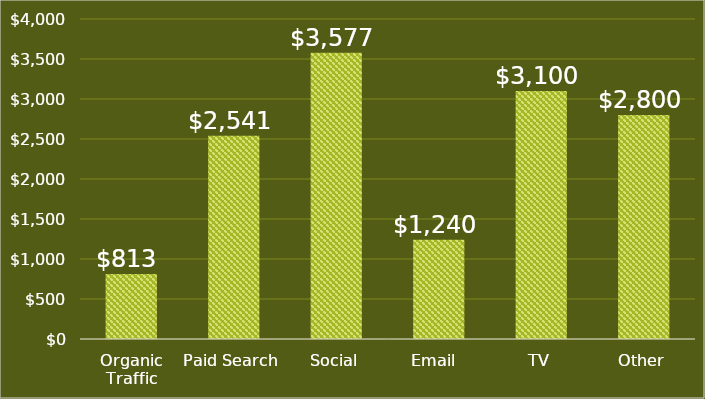
| Category | Profit per Acquisition |
|---|---|
| Organic Traffic | 813 |
| Paid Search | 2541 |
| Social | 3577 |
| Email  | 1240 |
| TV | 3100 |
| Other | 2800 |